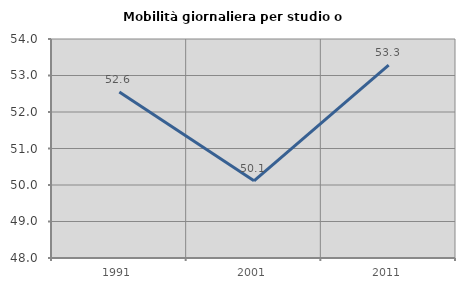
| Category | Mobilità giornaliera per studio o lavoro |
|---|---|
| 1991.0 | 52.551 |
| 2001.0 | 50.116 |
| 2011.0 | 53.282 |